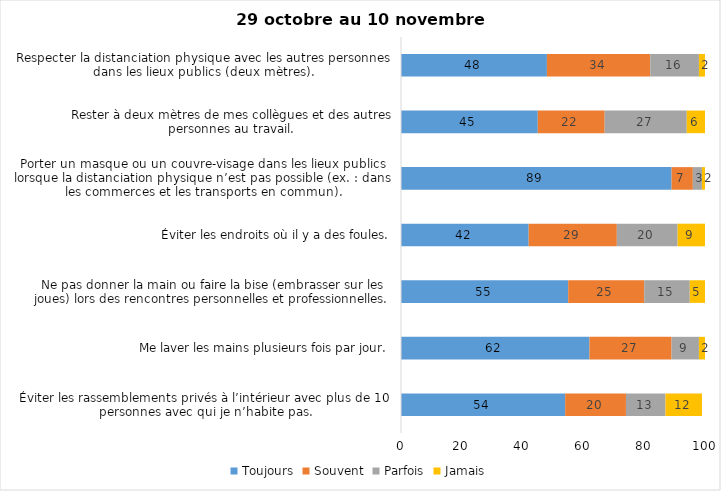
| Category | Toujours | Souvent | Parfois | Jamais |
|---|---|---|---|---|
| Éviter les rassemblements privés à l’intérieur avec plus de 10 personnes avec qui je n’habite pas. | 54 | 20 | 13 | 12 |
| Me laver les mains plusieurs fois par jour. | 62 | 27 | 9 | 2 |
| Ne pas donner la main ou faire la bise (embrasser sur les joues) lors des rencontres personnelles et professionnelles. | 55 | 25 | 15 | 5 |
| Éviter les endroits où il y a des foules. | 42 | 29 | 20 | 9 |
| Porter un masque ou un couvre-visage dans les lieux publics lorsque la distanciation physique n’est pas possible (ex. : dans les commerces et les transports en commun). | 89 | 7 | 3 | 2 |
| Rester à deux mètres de mes collègues et des autres personnes au travail. | 45 | 22 | 27 | 6 |
| Respecter la distanciation physique avec les autres personnes dans les lieux publics (deux mètres). | 48 | 34 | 16 | 2 |